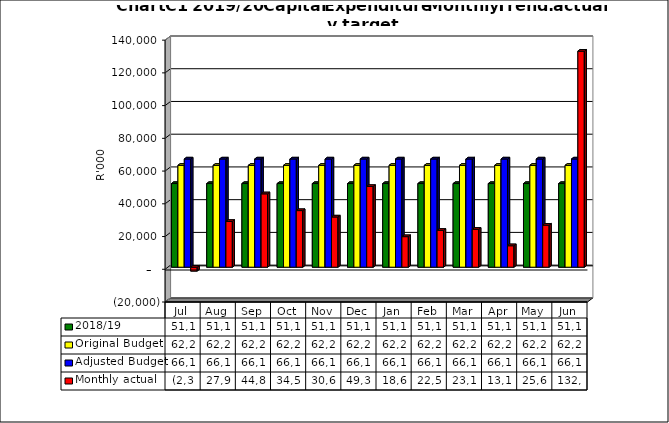
| Category | 2018/19 | Original Budget | Adjusted Budget | Monthly actual |
|---|---|---|---|---|
| Jul | 51123878.417 | 62228094.726 | 66115100 | -2354849.5 |
| Aug | 51123878.417 | 62228094.726 | 66115100 | 27946048.88 |
| Sep | 51123878.417 | 62228094.726 | 66115100 | 44831339.67 |
| Oct | 51123878.417 | 62228094.726 | 66115100 | 34585671.62 |
| Nov | 51123878.417 | 62228094.726 | 66115100 | 30684238.44 |
| Dec | 51123878.417 | 62228094.726 | 66115100 | 49312028.37 |
| Jan | 51123878.417 | 62228094.726 | 66115100 | 18669297.1 |
| Feb | 51123878.417 | 62228094.726 | 66115100 | 22502283.45 |
| Mar | 51123878.417 | 62228094.726 | 66115100 | 23165766.11 |
| Apr | 51123878.417 | 62228094.726 | 66115100 | 13115388.32 |
| May | 51123878.417 | 62228094.726 | 66115100 | 25664642.07 |
| Jun | 51123878.417 | 62228094.726 | 66115100 | 132006404 |